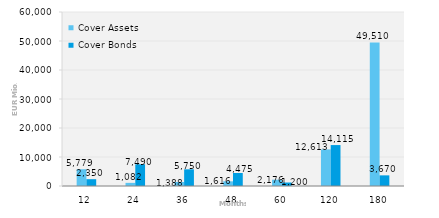
| Category | Cover Assets | Cover Bonds |
|---|---|---|
| 12.0 | 5779.43 | 2350 |
| 24.0 | 1081.72 | 7490 |
| 36.0 | 1387.65 | 5750 |
| 48.0 | 1615.71 | 4475 |
| 60.0 | 2175.88 | 1200 |
| 120.0 | 12613.26 | 14114.7 |
| 180.0 | 49509.74 | 3669.5 |